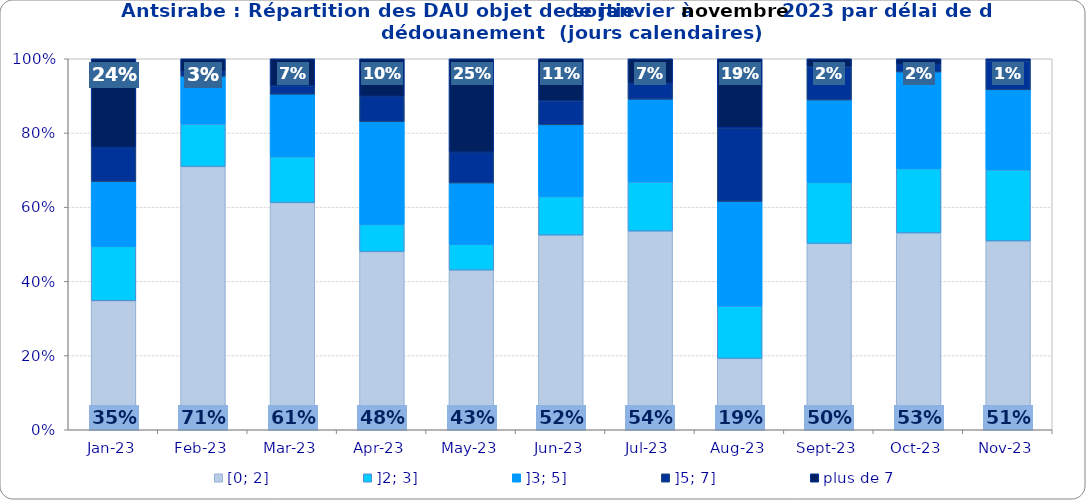
| Category | [0; 2] | ]2; 3] | ]3; 5] | ]5; 7] | plus de 7 |
|---|---|---|---|---|---|
| 2023-01-01 | 0.348 | 0.147 | 0.174 | 0.092 | 0.239 |
| 2023-02-01 | 0.709 | 0.115 | 0.128 | 0.014 | 0.034 |
| 2023-03-01 | 0.612 | 0.124 | 0.169 | 0.022 | 0.073 |
| 2023-04-01 | 0.48 | 0.073 | 0.277 | 0.068 | 0.102 |
| 2023-05-01 | 0.43 | 0.07 | 0.165 | 0.083 | 0.252 |
| 2023-06-01 | 0.525 | 0.104 | 0.193 | 0.064 | 0.114 |
| 2023-07-01 | 0.536 | 0.133 | 0.223 | 0.043 | 0.066 |
| 2023-08-01 | 0.192 | 0.141 | 0.282 | 0.199 | 0.186 |
| 2023-09-01 | 0.502 | 0.164 | 0.222 | 0.089 | 0.022 |
| 2023-10-01 | 0.531 | 0.173 | 0.26 | 0.02 | 0.015 |
| 2023-11-01 | 0.509 | 0.192 | 0.216 | 0.078 | 0.006 |